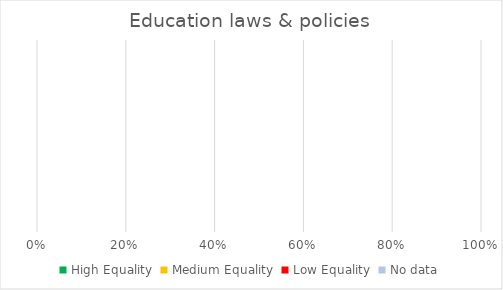
| Category | High Equality | Medium Equality | Low Equality | No data |
|---|---|---|---|---|
| 0 | 0 | 0 | 0 | 0 |